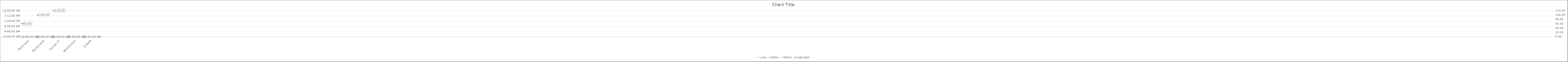
| Category | Luka | Darko | Martin |
|---|---|---|---|
| Oststrasse | 0 | 0 | 0 |
| Nordstrasse | 0 | 0 | 0 |
| Familie XY | 0 | 0 | 0 |
| Weststrasse | 0 | 0 | 0 |
| Südalle | 0 | 0 | 0 |